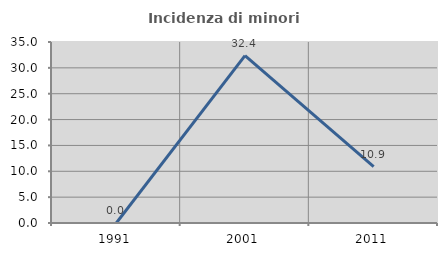
| Category | Incidenza di minori stranieri |
|---|---|
| 1991.0 | 0 |
| 2001.0 | 32.353 |
| 2011.0 | 10.909 |